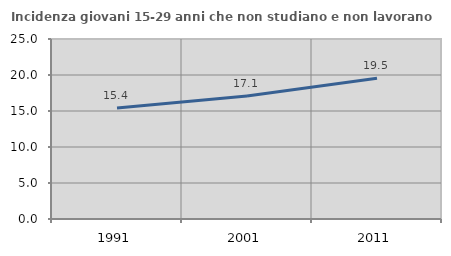
| Category | Incidenza giovani 15-29 anni che non studiano e non lavorano  |
|---|---|
| 1991.0 | 15.42 |
| 2001.0 | 17.071 |
| 2011.0 | 19.539 |